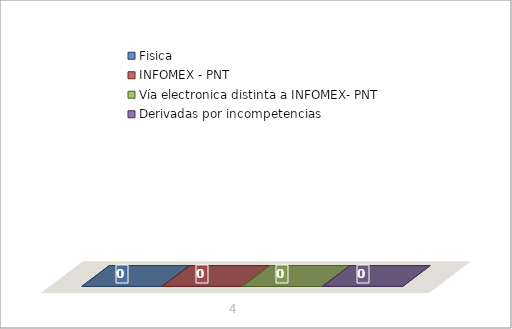
| Category | Fisica | INFOMEX - PNT | Vía electronica distinta a INFOMEX- PNT | Derivadas por incompetencias |
|---|---|---|---|---|
| 0 | 0 | 0 | 0 | 0 |